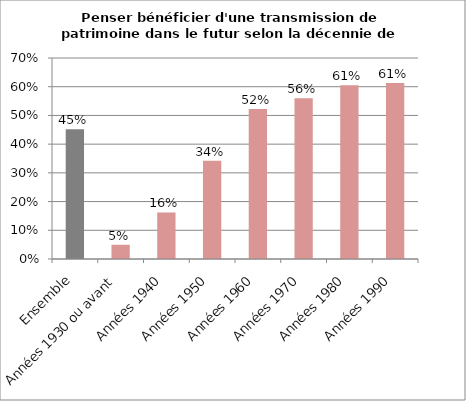
| Category | Penser bénéficier d'une transmission de patrimoine dans le futur selon la décennie de naissance |
|---|---|
| Ensemble | 0.452 |
| Années 1930 ou avant | 0.05 |
| Années 1940 | 0.162 |
| Années 1950 | 0.342 |
| Années 1960 | 0.522 |
| Années 1970 | 0.56 |
| Années 1980 | 0.605 |
| Années 1990 | 0.613 |